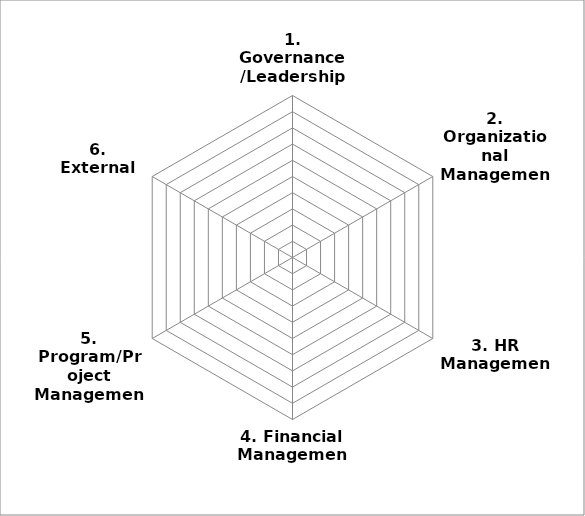
| Category | Organizational Capacity Assessment Total Scores by Category |
|---|---|
| 1. Governance/Leadership | 0 |
| 2. Organizational Management | 0 |
| 3. HR Management | 0 |
| 4. Financial Management | 0 |
| 5. Program/Project Management | 0 |
| 6. External Relations | 0 |